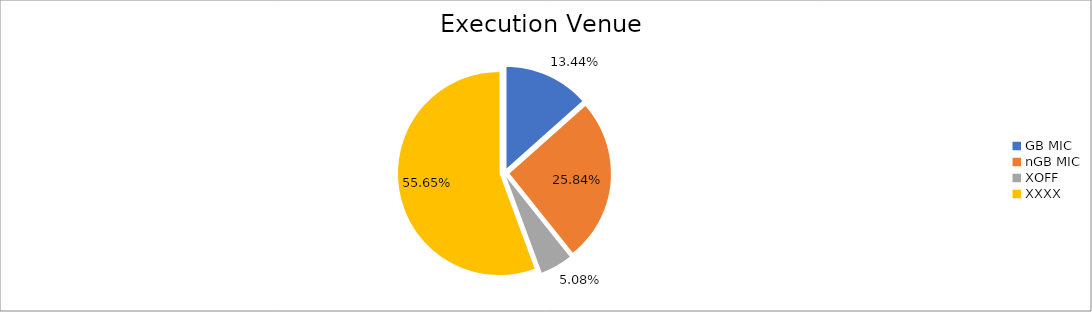
| Category | Series 0 |
|---|---|
| GB MIC | 1310301.26 |
| nGB MIC | 2519994.915 |
| XOFF | 495521.043 |
| XXXX | 5427014.059 |